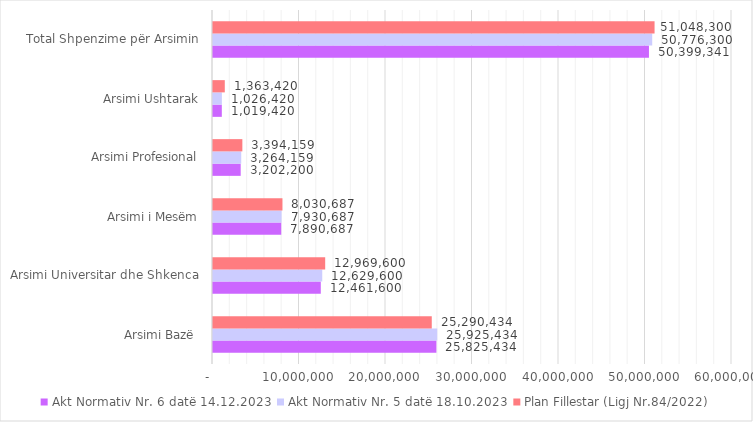
| Category | Akt Normativ Nr. 6 datë 14.12.2023 | Akt Normativ Nr. 5 datë 18.10.2023 | Plan Fillestar (Ligj Nr.84/2022) |
|---|---|---|---|
| Arsimi Bazë  | 25825434 | 25925434 | 25290434 |
| Arsimi Universitar dhe Shkenca | 12461600 | 12629600 | 12969600 |
| Arsimi i Mesëm | 7890687 | 7930687 | 8030687 |
| Arsimi Profesional | 3202200 | 3264159 | 3394159 |
| Arsimi Ushtarak | 1019420 | 1026420 | 1363420 |
| Total Shpenzime për Arsimin | 50399341 | 50776300 | 51048300 |